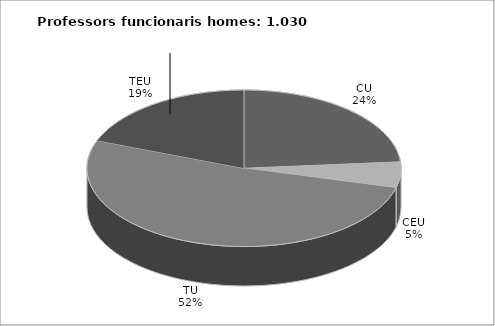
| Category | HOMES |
|---|---|
| CU | 244 |
| CEU | 55 |
| TU | 533 |
| TEU | 198 |